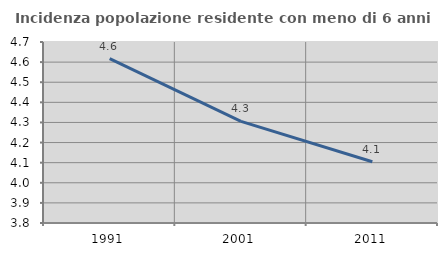
| Category | Incidenza popolazione residente con meno di 6 anni |
|---|---|
| 1991.0 | 4.617 |
| 2001.0 | 4.305 |
| 2011.0 | 4.105 |